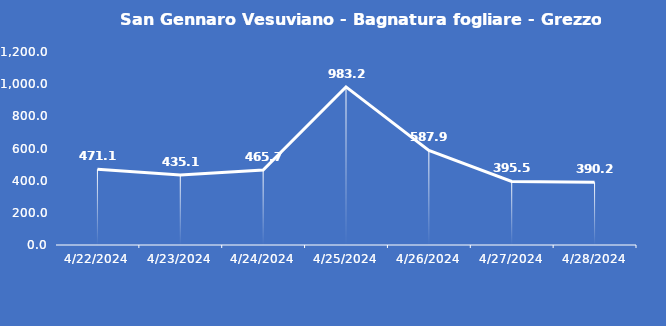
| Category | San Gennaro Vesuviano - Bagnatura fogliare - Grezzo (min) |
|---|---|
| 4/22/24 | 471.1 |
| 4/23/24 | 435.1 |
| 4/24/24 | 465.7 |
| 4/25/24 | 983.2 |
| 4/26/24 | 587.9 |
| 4/27/24 | 395.5 |
| 4/28/24 | 390.2 |